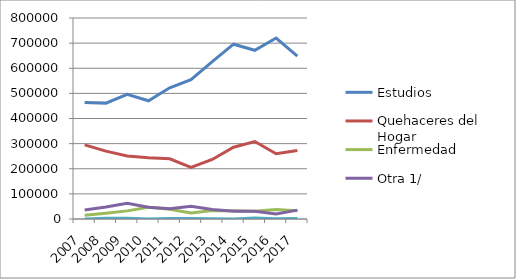
| Category | Estudios | Quehaceres del Hogar | Enfermedad | Otra 1/ | No Especificadas |
|---|---|---|---|---|---|
| 2007.0 | 463280 | 294931 | 15310 | 35671 | 0 |
| 2008.0 | 461217 | 270131 | 23299 | 48170 | 2886 |
| 2009.0 | 496035 | 251155 | 32312 | 62674 | 2638 |
| 2010.0 | 470587 | 244075 | 46382 | 47102 | 0 |
| 2011.0 | 522169 | 239827 | 38566 | 40685 | 1902 |
| 2012.0 | 554266 | 205656 | 23804 | 50589 | 1949 |
| 2013.0 | 625997 | 237022 | 33976 | 37596 | 763 |
| 2014.0 | 695754 | 285540 | 33039 | 30853 | 0 |
| 2015.0 | 671384 | 308440 | 31276 | 30857 | 3543 |
| 2016.0 | 720210 | 259474 | 37336 | 20002 | 1109 |
| 2017.0 | 648409 | 272571 | 32966 | 35233 | 1781 |